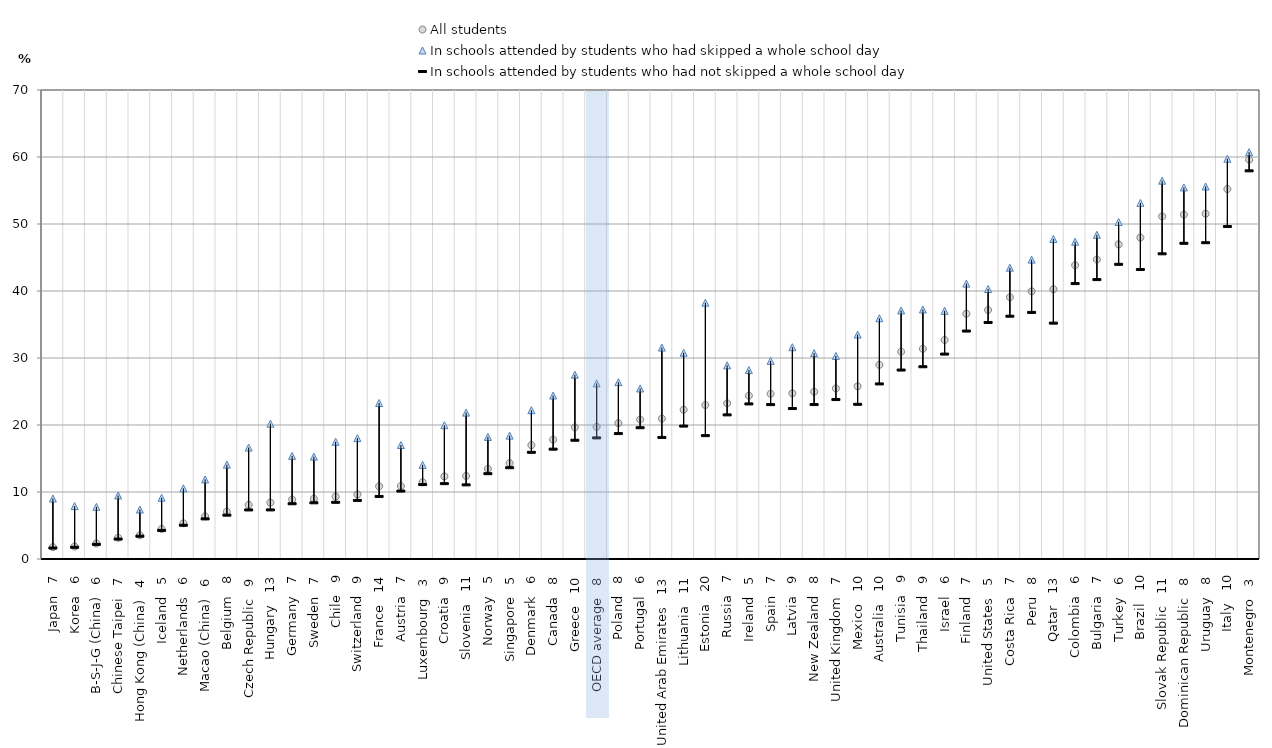
| Category | All students | In schools attended by students who had skipped a whole school day | In schools attended by students who had not skipped a whole school day |
|---|---|---|---|
| Japan   7 | 1.766 | 9.032 | 1.635 |
| Korea   6 | 1.865 | 7.899 | 1.75 |
| B-S-J-G (China)   6 | 2.314 | 7.785 | 2.185 |
| Chinese Taipei   7 | 3.179 | 9.485 | 2.972 |
| Hong Kong (China)   4 | 3.544 | 7.385 | 3.403 |
| Iceland   5 | 4.485 | 9.141 | 4.266 |
| Netherlands   6 | 5.33 | 10.554 | 5.036 |
| Macao (China)   6 | 6.363 | 11.878 | 5.989 |
| Belgium   8 | 7.077 | 14.081 | 6.543 |
| Czech Republic   9 | 8.075 | 16.631 | 7.324 |
| Hungary   13 | 8.413 | 20.202 | 7.33 |
| Germany   7 | 8.88 | 15.396 | 8.245 |
| Sweden   7 | 9.007 | 15.276 | 8.386 |
| Chile   9 | 9.302 | 17.497 | 8.462 |
| Switzerland   9 | 9.641 | 18.037 | 8.745 |
| France   14 | 10.849 | 23.28 | 9.336 |
| Austria   7 | 10.887 | 17.009 | 10.139 |
| Luxembourg   3 | 11.448 | 14.047 | 11.112 |
| Croatia   9 | 12.321 | 19.97 | 11.246 |
| Slovenia   11 | 12.402 | 21.851 | 11.064 |
| Norway   5 | 13.473 | 18.227 | 12.733 |
| Singapore   5 | 14.31 | 18.414 | 13.625 |
| Denmark   6 | 16.992 | 22.212 | 15.924 |
| Canada   8 | 17.82 | 24.4 | 16.393 |
| Greece   10 | 19.646 | 27.505 | 17.725 |
| OECD average   8 | 19.717 | 26.205 | 18.076 |
| Poland   8 | 20.275 | 26.391 | 18.72 |
| Portugal   6 | 20.813 | 25.457 | 19.593 |
| United Arab Emirates   13 | 20.959 | 31.558 | 18.148 |
| Lithuania   11 | 22.279 | 30.791 | 19.839 |
| Estonia   20 | 22.97 | 38.262 | 18.41 |
| Russia   7 | 23.228 | 28.907 | 21.51 |
| Ireland   5 | 24.377 | 28.198 | 23.146 |
| Spain   7 | 24.653 | 29.57 | 23.044 |
| Latvia   9 | 24.72 | 31.611 | 22.457 |
| New Zealand   8 | 24.97 | 30.739 | 23.05 |
| United Kingdom   7 | 25.459 | 30.312 | 23.801 |
| Mexico   10 | 25.771 | 33.496 | 23.089 |
| Australia   10 | 28.969 | 35.93 | 26.131 |
| Tunisia   9 | 30.956 | 37.096 | 28.202 |
| Thailand   9 | 31.374 | 37.24 | 28.693 |
| Israel   6 | 32.695 | 37.041 | 30.584 |
| Finland   7 | 36.613 | 41.102 | 34.021 |
| United States   5 | 37.157 | 40.293 | 35.302 |
| Costa Rica   7 | 39.067 | 43.481 | 36.236 |
| Peru   8 | 39.954 | 44.69 | 36.804 |
| Qatar   13 | 40.261 | 47.769 | 35.201 |
| Colombia   6 | 43.848 | 47.357 | 41.107 |
| Bulgaria   7 | 44.692 | 48.394 | 41.7 |
| Turkey   6 | 46.954 | 50.307 | 43.985 |
| Brazil   10 | 47.976 | 53.15 | 43.205 |
| Slovak Republic   11 | 51.131 | 56.464 | 45.551 |
| Dominican Republic   8 | 51.407 | 55.458 | 47.121 |
| Uruguay   8 | 51.532 | 55.601 | 47.206 |
| Italy   10 | 55.21 | 59.74 | 49.625 |
| Montenegro   3 | 59.599 | 60.727 | 57.936 |